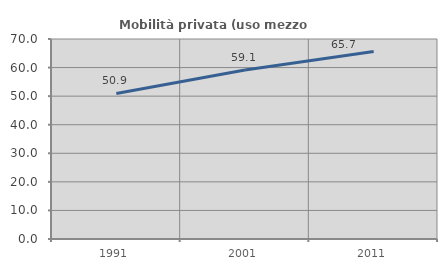
| Category | Mobilità privata (uso mezzo privato) |
|---|---|
| 1991.0 | 50.925 |
| 2001.0 | 59.115 |
| 2011.0 | 65.663 |